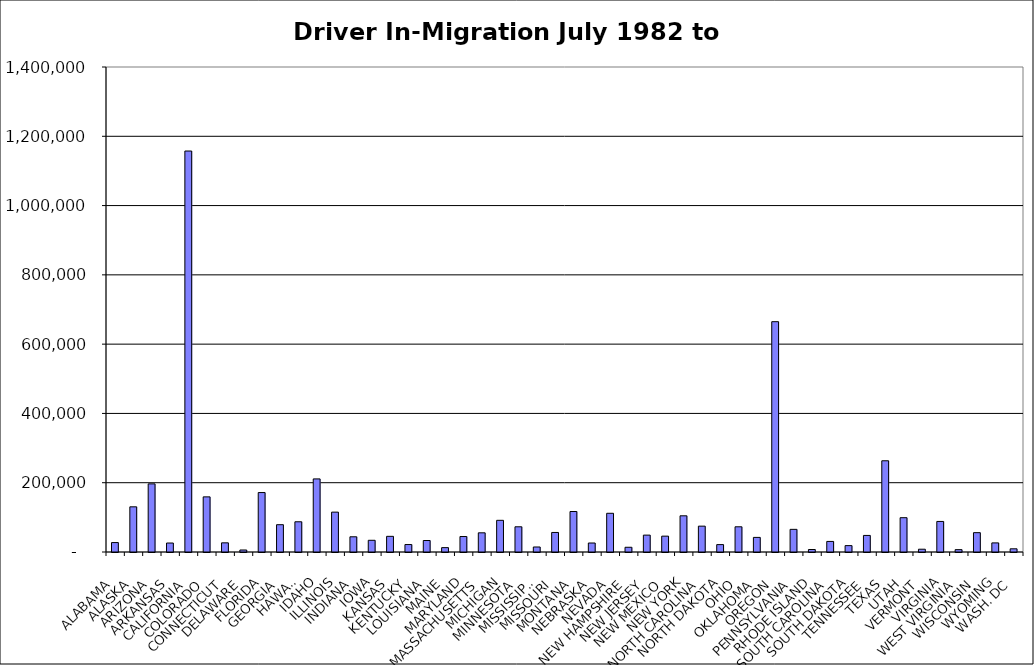
| Category | Series 0 |
|---|---|
| ALABAMA | 27226.5 |
| ALASKA | 130426.5 |
| ARIZONA | 196687 |
| ARKANSAS | 25910.5 |
| CALIFORNIA | 1157440.5 |
| COLORADO | 159166 |
| CONNECTICUT | 26468 |
| DELAWARE | 5811.5 |
| FLORIDA | 171577 |
| GEORGIA | 78832 |
| HAWAII | 87254.5 |
| IDAHO | 210984.5 |
| ILLINOIS | 115090.5 |
| INDIANA | 43916 |
| IOWA | 33789.5 |
| KANSAS | 45194.5 |
| KENTUCKY | 21548 |
| LOUISIANA | 33183.5 |
| MAINE | 12592.5 |
| MARYLAND | 44683 |
| MASSACHUSETTS | 55345 |
| MICHIGAN | 91463 |
| MINNESOTA | 72784.5 |
| MISSISSIPPI | 14478 |
| MISSOURI | 56387 |
| MONTANA | 116890 |
| NEBRASKA | 25938.5 |
| NEVADA | 111741 |
| NEW HAMPSHIRE | 13638.5 |
| NEW JERSEY | 48751 |
| NEW MEXICO | 45754 |
| NEW YORK | 104476 |
| NORTH CAROLINA | 74625.5 |
| NORTH DAKOTA | 21350.5 |
| OHIO | 72756.5 |
| OKLAHOMA | 42147 |
| OREGON | 664860 |
| PENNSYLVANIA | 65398.5 |
| RHODE ISLAND | 7194 |
| SOUTH CAROLINA | 30500.5 |
| SOUTH DAKOTA | 18426.5 |
| TENNESSEE | 47847.5 |
| TEXAS | 263341 |
| UTAH | 99024.5 |
| VERMONT | 8039 |
| VIRGINIA | 88212 |
| WEST VIRGINIA | 6787.5 |
| WISCONSIN | 55813.5 |
| WYOMING | 26277 |
| WASH. DC | 9215 |